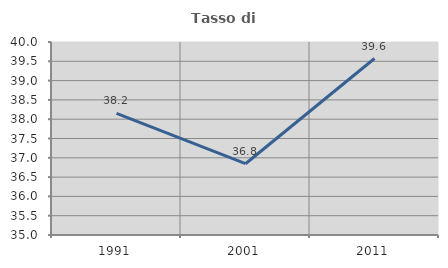
| Category | Tasso di occupazione   |
|---|---|
| 1991.0 | 38.154 |
| 2001.0 | 36.847 |
| 2011.0 | 39.572 |